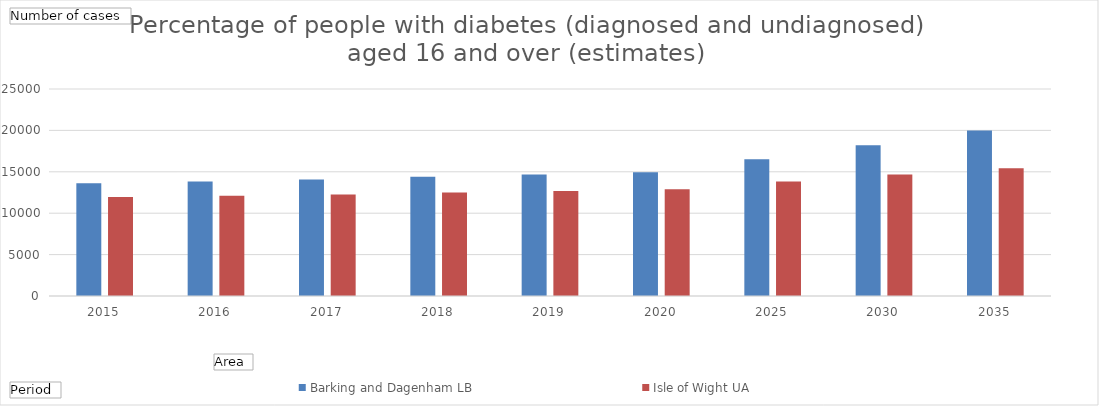
| Category | Barking and Dagenham LB | Isle of Wight UA |
|---|---|---|
| 2015 | 13631.225 | 11969.977 |
| 2016 | 13837.665 | 12116.619 |
| 2017 | 14084.118 | 12261.918 |
| 2018 | 14410.562 | 12489.702 |
| 2019 | 14680.486 | 12670.799 |
| 2020 | 14931.584 | 12887.488 |
| 2025 | 16510.861 | 13829.474 |
| 2030 | 18215.761 | 14686.248 |
| 2035 | 19980.657 | 15415.098 |